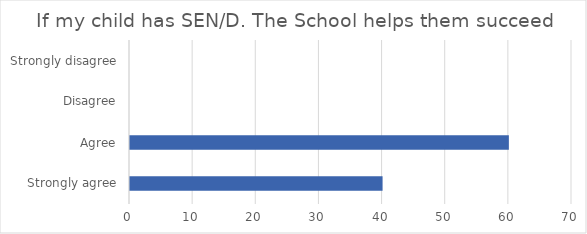
| Category | Series 1 |
|---|---|
| Strongly agree | 40 |
| Agree | 60 |
| Disagree | 0 |
| Strongly disagree | 0 |